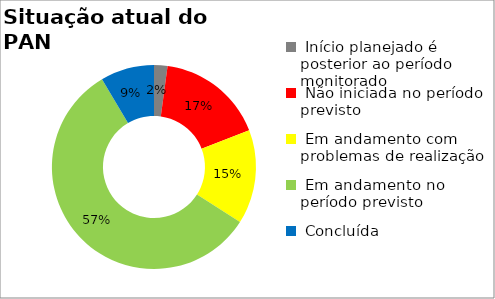
| Category | Series 0 |
|---|---|
|  Início planejado é posterior ao período monitorado | 0.021 |
|  Não iniciada no período previsto | 0.17 |
|  Em andamento com problemas de realização | 0.149 |
|  Em andamento no período previsto  | 0.574 |
|  Concluída | 0.085 |